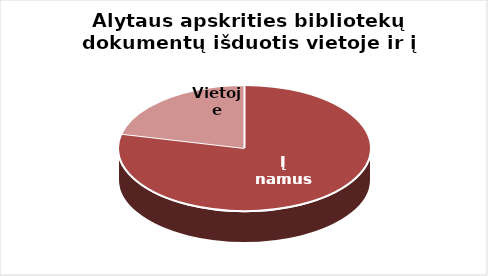
| Category | Series 0 |
|---|---|
| Į namus | 505440 |
| Vietoje | 137276 |